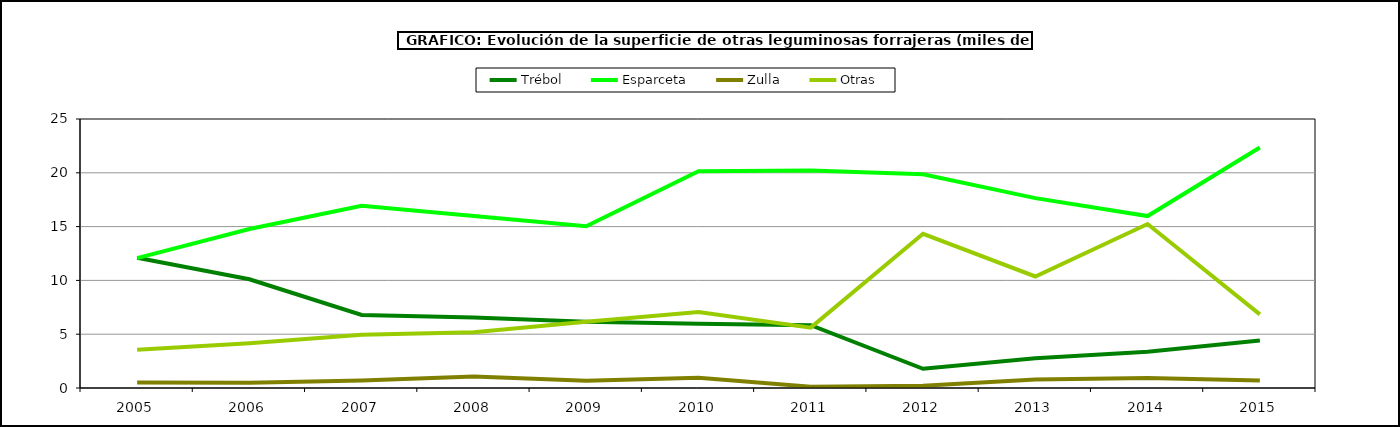
| Category | Trébol | Esparceta | Zulla | Otras |
|---|---|---|---|---|
| 2005.0 | 12.108 | 12.068 | 0.509 | 3.556 |
| 2006.0 | 10.102 | 14.776 | 0.488 | 4.154 |
| 2007.0 | 6.792 | 16.94 | 0.703 | 4.949 |
| 2008.0 | 6.551 | 15.979 | 1.06 | 5.192 |
| 2009.0 | 6.149 | 15.028 | 0.667 | 6.159 |
| 2010.0 | 5.977 | 20.154 | 0.957 | 7.056 |
| 2011.0 | 5.836 | 20.216 | 0.117 | 5.61 |
| 2012.0 | 1.782 | 19.86 | 0.202 | 14.331 |
| 2013.0 | 2.77 | 17.645 | 0.8 | 10.366 |
| 2014.0 | 3.361 | 15.981 | 0.92 | 15.244 |
| 2015.0 | 4.404 | 22.35 | 0.693 | 6.846 |